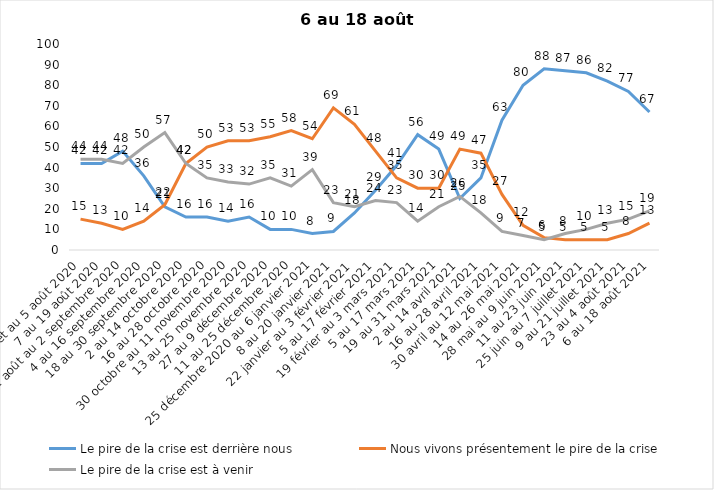
| Category | Le pire de la crise est derrière nous | Nous vivons présentement le pire de la crise | Le pire de la crise est à venir |
|---|---|---|---|
| 24 juillet au 5 août 2020 | 42 | 15 | 44 |
| 7 au 19 août 2020 | 42 | 13 | 44 |
| 21 août au 2 septembre 2020 | 48 | 10 | 42 |
| 4 au 16 septembre 2020 | 36 | 14 | 50 |
| 18 au 30 septembre 2020 | 21 | 22 | 57 |
| 2 au 14 octobre 2020 | 16 | 42 | 42 |
| 16 au 28 octobre 2020 | 16 | 50 | 35 |
| 30 octobre au 11 novembre 2020 | 14 | 53 | 33 |
| 13 au 25 novembre 2020 | 16 | 53 | 32 |
| 27 au 9 décembre 2020 | 10 | 55 | 35 |
| 11 au 25 décembre 2020 | 10 | 58 | 31 |
| 25 décembre 2020 au 6 janvier 2021 | 8 | 54 | 39 |
| 8 au 20 janvier 2021 | 9 | 69 | 23 |
| 22 janvier au 3 février 2021 | 18 | 61 | 21 |
| 5 au 17 février 2021 | 29 | 48 | 24 |
| 19 février au 3 mars 2021 | 41 | 35 | 23 |
| 5 au 17 mars 2021 | 56 | 30 | 14 |
| 19 au 31 mars 2021 | 49 | 30 | 21 |
| 2 au 14 avril 2021 | 25 | 49 | 26 |
| 16 au 28 avril 2021 | 35 | 47 | 18 |
| 30 avril au 12 mai 2021 | 63 | 27 | 9 |
| 14 au 26 mai 2021 | 80 | 12 | 7 |
| 28 mai au 9 juin 2021 | 88 | 6 | 5 |
| 11 au 23 juin 2021 | 87 | 5 | 8 |
| 25 juin au 7 juillet 2021 | 86 | 5 | 10 |
| 9 au 21 juillet 2021 | 82 | 5 | 13 |
| 23 au 4 août 2021 | 77 | 8 | 15 |
| 6 au 18 août 2021 | 67 | 13 | 19 |